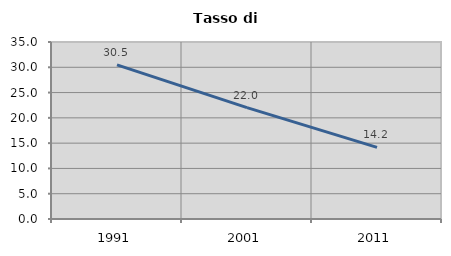
| Category | Tasso di disoccupazione   |
|---|---|
| 1991.0 | 30.477 |
| 2001.0 | 22.019 |
| 2011.0 | 14.159 |